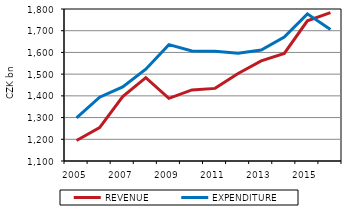
| Category | REVENUE | EXPENDITURE |
|---|---|---|
| 2005.0 | 1194.582 | 1298.437 |
| 2006.0 | 1253.426 | 1394.041 |
| 2007.0 | 1396.993 | 1441.31 |
| 2008.0 | 1483.836 | 1522.943 |
| 2009.0 | 1388.397 | 1635.946 |
| 2010.0 | 1427.235 | 1606.753 |
| 2011.0 | 1434.434 | 1605.821 |
| 2012.0 | 1503.044 | 1595.929 |
| 2013.0 | 1560.994 | 1610.732 |
| 2014.0 | 1595.469 | 1670.461 |
| 2015.0 | 1745.344 | 1777.729 |
| 2016.0 | 1783.564 | 1705.695 |